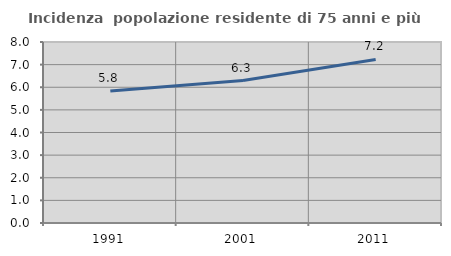
| Category | Incidenza  popolazione residente di 75 anni e più |
|---|---|
| 1991.0 | 5.838 |
| 2001.0 | 6.298 |
| 2011.0 | 7.228 |